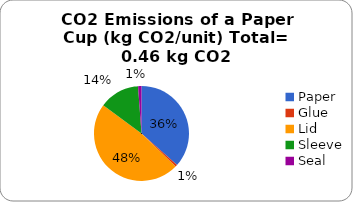
| Category | Series 0 |
|---|---|
| Paper | 0.017 |
| Glue | 0 |
| Lid | 0.022 |
| Sleeve | 0.006 |
| Seal | 0.001 |